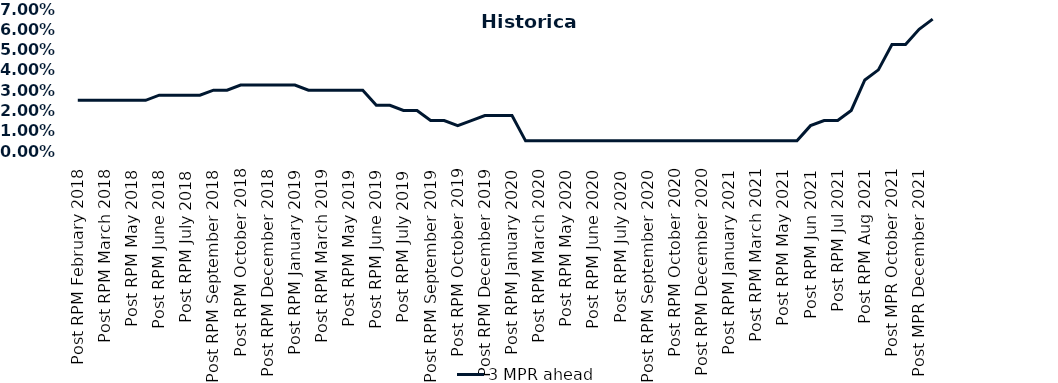
| Category | 3 MPR ahead |
|---|---|
| Post RPM February 2018 | 0.025 |
| Pre RPM March 2018 | 0.025 |
| Post RPM March 2018 | 0.025 |
| Pre RPM May 2018 | 0.025 |
| Post RPM May 2018 | 0.025 |
| Pre RPM June 2018 | 0.025 |
| Post RPM June 2018 | 0.028 |
| Pre RPM July 2018 | 0.028 |
| Post RPM July 2018 | 0.028 |
| Pre RPM September 2018 | 0.028 |
| Post RPM September 2018 | 0.03 |
| Pre RPM October 2018 | 0.03 |
| Post RPM October 2018 | 0.032 |
| Pre RPM December 2018 | 0.032 |
| Post RPM December 2018 | 0.032 |
| Pre RPM January 2019 | 0.032 |
| Post RPM January 2019 | 0.032 |
| Pre RPM March 2019 | 0.03 |
| Post RPM March 2019 | 0.03 |
| Pre RPM May 2019 | 0.03 |
| Post RPM May 2019 | 0.03 |
| Pre RPM June 2019 | 0.03 |
| Post RPM June 2019 | 0.022 |
| Pre RPM July 2019 | 0.022 |
| Post RPM July 2019 | 0.02 |
| Pre RPM September 2019 | 0.02 |
| Post RPM September 2019 | 0.015 |
| Pre RPM October 2019 | 0.015 |
| Post RPM October 2019 | 0.012 |
| Pre RPM December 2019 | 0.015 |
| Post RPM December 2019 | 0.018 |
| Pre RPM January 2020 | 0.018 |
| Post RPM January 2020 | 0.018 |
| Pre RPM March 2020 | 0.005 |
| Post RPM March 2020 | 0.005 |
| Pre RPM May 2020 | 0.005 |
| Post RPM May 2020 | 0.005 |
| Pre RPM June 2020 | 0.005 |
| Post RPM June 2020 | 0.005 |
| Pre RPM July 2020 | 0.005 |
| Post RPM July 2020 | 0.005 |
| Pre RPM September 2020 | 0.005 |
| Post RPM September 2020 | 0.005 |
| Pre RPM October 2020 | 0.005 |
| Post RPM October 2020 | 0.005 |
| Pre RPM December 2020 | 0.005 |
|  Post RPM December 2020 | 0.005 |
| Pre RPM January 2021 | 0.005 |
| Post RPM January 2021 | 0.005 |
|  Pre RPM March 2021 | 0.005 |
|  Post RPM March 2021 | 0.005 |
|  Pre RPM May 2021 | 0.005 |
|  Post RPM May 2021 | 0.005 |
|  Pre RPM Jun 2021 | 0.005 |
|   Post RPM Jun 2021 | 0.012 |
| Pre RPM Jul 2021 | 0.015 |
|  Post RPM Jul 2021 | 0.015 |
| Pre RPM Aug 2021 | 0.02 |
|  Post RPM Aug 2021 | 0.035 |
| Pre MPR October 2021 | 0.04 |
| Post MPR October 2021 | 0.052 |
| Pre MPR December 2021 | 0.052 |
| Post MPR December 2021 | 0.06 |
| Pre MPR January 2022 | 0.065 |